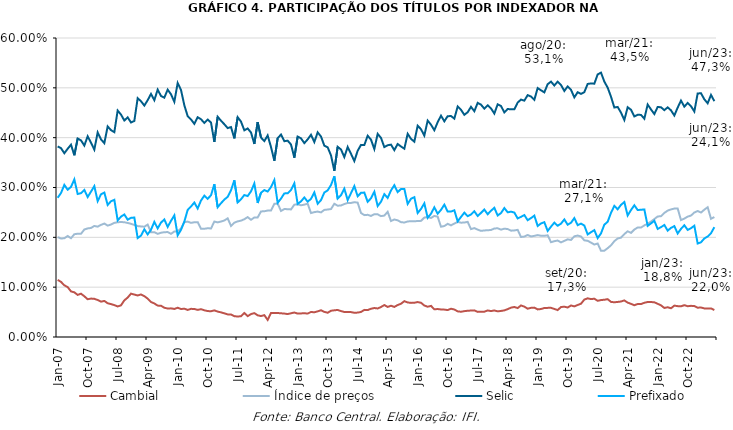
| Category | Cambial | Índice de preços | Selic | Prefixado |
|---|---|---|---|---|
| 2007-01-01 | 0.115 | 0.201 | 0.382 | 0.279 |
| 2007-02-01 | 0.111 | 0.198 | 0.379 | 0.289 |
| 2007-03-01 | 0.104 | 0.198 | 0.369 | 0.305 |
| 2007-04-01 | 0.1 | 0.203 | 0.378 | 0.296 |
| 2007-05-01 | 0.092 | 0.198 | 0.386 | 0.301 |
| 2007-06-01 | 0.09 | 0.206 | 0.365 | 0.316 |
| 2007-07-01 | 0.084 | 0.207 | 0.398 | 0.287 |
| 2007-08-01 | 0.087 | 0.207 | 0.395 | 0.289 |
| 2007-09-01 | 0.082 | 0.216 | 0.384 | 0.295 |
| 2007-10-01 | 0.076 | 0.218 | 0.403 | 0.281 |
| 2007-11-01 | 0.077 | 0.219 | 0.39 | 0.292 |
| 2007-12-01 | 0.077 | 0.223 | 0.376 | 0.303 |
| 2008-01-01 | 0.074 | 0.221 | 0.41 | 0.273 |
| 2008-02-01 | 0.071 | 0.225 | 0.397 | 0.286 |
| 2008-03-01 | 0.072 | 0.228 | 0.389 | 0.29 |
| 2008-04-01 | 0.068 | 0.224 | 0.423 | 0.265 |
| 2008-05-01 | 0.066 | 0.226 | 0.415 | 0.272 |
| 2008-06-01 | 0.064 | 0.229 | 0.411 | 0.275 |
| 2008-07-01 | 0.061 | 0.23 | 0.454 | 0.234 |
| 2008-08-01 | 0.064 | 0.231 | 0.446 | 0.242 |
| 2008-09-01 | 0.073 | 0.23 | 0.434 | 0.246 |
| 2008-10-01 | 0.079 | 0.229 | 0.441 | 0.235 |
| 2008-11-01 | 0.087 | 0.227 | 0.43 | 0.239 |
| 2008-12-01 | 0.085 | 0.225 | 0.434 | 0.24 |
| 2009-01-01 | 0.083 | 0.223 | 0.479 | 0.199 |
| 2009-02-01 | 0.085 | 0.222 | 0.473 | 0.203 |
| 2009-03-01 | 0.082 | 0.221 | 0.464 | 0.216 |
| 2009-04-01 | 0.077 | 0.226 | 0.475 | 0.206 |
| 2009-05-01 | 0.07 | 0.21 | 0.488 | 0.215 |
| 2009-06-01 | 0.067 | 0.21 | 0.475 | 0.231 |
| 2009-07-01 | 0.063 | 0.207 | 0.496 | 0.218 |
| 2009-08-01 | 0.063 | 0.209 | 0.484 | 0.23 |
| 2009-09-01 | 0.059 | 0.21 | 0.48 | 0.236 |
| 2009-10-01 | 0.057 | 0.211 | 0.496 | 0.221 |
| 2009-11-01 | 0.057 | 0.207 | 0.487 | 0.233 |
| 2009-12-01 | 0.056 | 0.212 | 0.472 | 0.244 |
| 2010-01-01 | 0.059 | 0.212 | 0.51 | 0.204 |
| 2010-02-01 | 0.056 | 0.218 | 0.496 | 0.215 |
| 2010-03-01 | 0.057 | 0.23 | 0.465 | 0.232 |
| 2010-04-01 | 0.054 | 0.232 | 0.443 | 0.255 |
| 2010-05-01 | 0.056 | 0.229 | 0.437 | 0.262 |
| 2010-06-01 | 0.056 | 0.23 | 0.428 | 0.27 |
| 2010-07-01 | 0.054 | 0.23 | 0.441 | 0.258 |
| 2010-08-01 | 0.056 | 0.217 | 0.437 | 0.274 |
| 2010-09-01 | 0.054 | 0.217 | 0.43 | 0.284 |
| 2010-10-01 | 0.052 | 0.218 | 0.436 | 0.277 |
| 2010-11-01 | 0.052 | 0.218 | 0.43 | 0.284 |
| 2010-12-01 | 0.053 | 0.232 | 0.391 | 0.307 |
| 2011-01-01 | 0.051 | 0.23 | 0.442 | 0.26 |
| 2011-02-01 | 0.049 | 0.232 | 0.434 | 0.268 |
| 2011-03-01 | 0.047 | 0.234 | 0.427 | 0.276 |
| 2011-04-01 | 0.045 | 0.238 | 0.419 | 0.281 |
| 2011-05-01 | 0.045 | 0.223 | 0.421 | 0.294 |
| 2011-06-01 | 0.042 | 0.229 | 0.399 | 0.315 |
| 2011-07-01 | 0.041 | 0.232 | 0.441 | 0.27 |
| 2011-08-01 | 0.042 | 0.233 | 0.432 | 0.276 |
| 2011-09-01 | 0.048 | 0.236 | 0.415 | 0.285 |
| 2011-10-01 | 0.042 | 0.241 | 0.418 | 0.283 |
| 2011-11-01 | 0.046 | 0.235 | 0.41 | 0.292 |
| 2011-12-01 | 0.048 | 0.24 | 0.387 | 0.308 |
| 2012-01-01 | 0.044 | 0.24 | 0.431 | 0.269 |
| 2012-02-01 | 0.042 | 0.252 | 0.4 | 0.29 |
| 2012-03-01 | 0.044 | 0.252 | 0.393 | 0.295 |
| 2012-04-01 | 0.034 | 0.254 | 0.404 | 0.292 |
| 2012-05-01 | 0.048 | 0.254 | 0.381 | 0.301 |
| 2012-06-01 | 0.048 | 0.267 | 0.354 | 0.315 |
| 2012-07-01 | 0.048 | 0.268 | 0.399 | 0.269 |
| 2012-08-01 | 0.048 | 0.253 | 0.406 | 0.278 |
| 2012-09-01 | 0.047 | 0.257 | 0.393 | 0.288 |
| 2012-10-01 | 0.046 | 0.256 | 0.394 | 0.288 |
| 2012-11-01 | 0.048 | 0.256 | 0.386 | 0.295 |
| 2012-12-01 | 0.049 | 0.266 | 0.36 | 0.308 |
| 2013-01-01 | 0.047 | 0.266 | 0.402 | 0.267 |
| 2013-02-01 | 0.047 | 0.264 | 0.399 | 0.272 |
| 2013-03-01 | 0.048 | 0.266 | 0.389 | 0.28 |
| 2013-04-01 | 0.047 | 0.268 | 0.397 | 0.272 |
| 2013-05-01 | 0.05 | 0.249 | 0.406 | 0.277 |
| 2013-06-01 | 0.05 | 0.251 | 0.391 | 0.29 |
| 2013-07-01 | 0.051 | 0.252 | 0.411 | 0.267 |
| 2013-08-01 | 0.054 | 0.25 | 0.402 | 0.275 |
| 2013-09-01 | 0.05 | 0.255 | 0.384 | 0.29 |
| 2013-10-01 | 0.049 | 0.256 | 0.381 | 0.294 |
| 2013-11-01 | 0.053 | 0.257 | 0.364 | 0.305 |
| 2013-12-01 | 0.054 | 0.267 | 0.334 | 0.323 |
| 2014-01-01 | 0.054 | 0.263 | 0.382 | 0.278 |
| 2014-02-01 | 0.052 | 0.264 | 0.376 | 0.285 |
| 2014-03-01 | 0.05 | 0.267 | 0.361 | 0.298 |
| 2014-04-01 | 0.05 | 0.269 | 0.381 | 0.275 |
| 2014-05-01 | 0.05 | 0.269 | 0.368 | 0.289 |
| 2014-06-01 | 0.049 | 0.271 | 0.353 | 0.303 |
| 2014-07-01 | 0.049 | 0.27 | 0.374 | 0.282 |
| 2014-08-01 | 0.05 | 0.249 | 0.386 | 0.289 |
| 2014-09-01 | 0.054 | 0.245 | 0.385 | 0.29 |
| 2014-10-01 | 0.054 | 0.245 | 0.404 | 0.271 |
| 2014-11-01 | 0.057 | 0.243 | 0.396 | 0.278 |
| 2014-12-01 | 0.058 | 0.246 | 0.377 | 0.292 |
| 2015-01-01 | 0.057 | 0.246 | 0.408 | 0.263 |
| 2015-02-01 | 0.06 | 0.243 | 0.4 | 0.271 |
| 2015-03-01 | 0.064 | 0.244 | 0.381 | 0.287 |
| 2015-04-01 | 0.06 | 0.251 | 0.385 | 0.279 |
| 2015-05-01 | 0.063 | 0.233 | 0.386 | 0.294 |
| 2015-06-01 | 0.06 | 0.236 | 0.375 | 0.305 |
| 2015-07-01 | 0.064 | 0.234 | 0.387 | 0.291 |
| 2015-08-01 | 0.067 | 0.23 | 0.382 | 0.297 |
| 2015-09-01 | 0.072 | 0.23 | 0.378 | 0.297 |
| 2015-10-01 | 0.069 | 0.232 | 0.408 | 0.267 |
| 2015-11-01 | 0.068 | 0.232 | 0.398 | 0.277 |
| 2015-12-01 | 0.069 | 0.232 | 0.392 | 0.281 |
| 2016-01-01 | 0.07 | 0.233 | 0.424 | 0.249 |
| 2016-02-01 | 0.069 | 0.233 | 0.417 | 0.257 |
| 2016-03-01 | 0.063 | 0.24 | 0.404 | 0.268 |
| 2016-04-01 | 0.061 | 0.241 | 0.434 | 0.239 |
| 2016-05-01 | 0.062 | 0.239 | 0.426 | 0.247 |
| 2016-06-01 | 0.056 | 0.243 | 0.415 | 0.26 |
| 2016-07-01 | 0.056 | 0.242 | 0.431 | 0.247 |
| 2016-08-01 | 0.055 | 0.221 | 0.444 | 0.255 |
| 2016-09-01 | 0.055 | 0.223 | 0.433 | 0.266 |
| 2016-10-01 | 0.054 | 0.227 | 0.443 | 0.252 |
| 2016-11-01 | 0.057 | 0.224 | 0.443 | 0.252 |
| 2016-12-01 | 0.055 | 0.228 | 0.438 | 0.254 |
| 2017-01-01 | 0.051 | 0.231 | 0.462 | 0.232 |
| 2017-02-01 | 0.051 | 0.229 | 0.456 | 0.241 |
| 2017-03-01 | 0.052 | 0.23 | 0.446 | 0.249 |
| 2017-04-01 | 0.053 | 0.231 | 0.451 | 0.243 |
| 2017-05-01 | 0.053 | 0.216 | 0.462 | 0.246 |
| 2017-06-01 | 0.053 | 0.219 | 0.453 | 0.252 |
| 2017-07-01 | 0.05 | 0.215 | 0.47 | 0.243 |
| 2017-08-01 | 0.05 | 0.213 | 0.466 | 0.249 |
| 2017-09-01 | 0.051 | 0.214 | 0.458 | 0.256 |
| 2017-10-01 | 0.053 | 0.214 | 0.465 | 0.246 |
| 2017-11-01 | 0.052 | 0.215 | 0.459 | 0.253 |
| 2017-12-01 | 0.053 | 0.218 | 0.448 | 0.259 |
| 2018-01-01 | 0.052 | 0.218 | 0.467 | 0.244 |
| 2018-02-01 | 0.052 | 0.215 | 0.464 | 0.249 |
| 2018-03-01 | 0.053 | 0.217 | 0.451 | 0.259 |
| 2018-04-01 | 0.056 | 0.217 | 0.458 | 0.25 |
| 2018-05-01 | 0.059 | 0.213 | 0.457 | 0.252 |
| 2018-06-01 | 0.06 | 0.214 | 0.457 | 0.25 |
| 2018-07-01 | 0.058 | 0.215 | 0.47 | 0.238 |
| 2018-08-01 | 0.063 | 0.201 | 0.476 | 0.241 |
| 2018-09-01 | 0.061 | 0.202 | 0.474 | 0.245 |
| 2018-10-01 | 0.057 | 0.205 | 0.485 | 0.234 |
| 2018-11-01 | 0.058 | 0.202 | 0.483 | 0.239 |
| 2018-12-01 | 0.059 | 0.203 | 0.476 | 0.244 |
| 2019-01-01 | 0.055 | 0.204 | 0.5 | 0.223 |
| 2019-02-01 | 0.056 | 0.203 | 0.495 | 0.228 |
| 2019-03-01 | 0.058 | 0.203 | 0.491 | 0.23 |
| 2019-04-01 | 0.058 | 0.204 | 0.507 | 0.213 |
| 2019-05-01 | 0.059 | 0.19 | 0.512 | 0.221 |
| 2019-06-01 | 0.056 | 0.192 | 0.505 | 0.229 |
| 2019-07-01 | 0.054 | 0.194 | 0.512 | 0.223 |
| 2019-08-01 | 0.06 | 0.19 | 0.506 | 0.227 |
| 2019-09-01 | 0.061 | 0.193 | 0.494 | 0.236 |
| 2019-10-01 | 0.059 | 0.196 | 0.503 | 0.225 |
| 2019-11-01 | 0.063 | 0.195 | 0.496 | 0.229 |
| 2019-12-01 | 0.061 | 0.202 | 0.481 | 0.239 |
| 2020-01-01 | 0.064 | 0.204 | 0.491 | 0.224 |
| 2020-02-01 | 0.067 | 0.202 | 0.488 | 0.228 |
| 2020-03-01 | 0.075 | 0.194 | 0.491 | 0.224 |
| 2020-04-01 | 0.078 | 0.193 | 0.508 | 0.206 |
| 2020-05-01 | 0.076 | 0.189 | 0.509 | 0.21 |
| 2020-06-01 | 0.077 | 0.186 | 0.508 | 0.214 |
| 2020-07-01 | 0.073 | 0.188 | 0.527 | 0.198 |
| 2020-08-01 | 0.074 | 0.173 | 0.531 | 0.208 |
| 2020-09-01 | 0.075 | 0.173 | 0.513 | 0.225 |
| 2020-10-01 | 0.076 | 0.178 | 0.5 | 0.231 |
| 2020-11-01 | 0.07 | 0.184 | 0.482 | 0.249 |
| 2020-12-01 | 0.07 | 0.192 | 0.461 | 0.263 |
| 2021-01-01 | 0.07 | 0.198 | 0.462 | 0.256 |
| 2021-02-01 | 0.071 | 0.199 | 0.45 | 0.265 |
| 2021-03-01 | 0.073 | 0.207 | 0.435 | 0.271 |
| 2021-04-01 | 0.069 | 0.212 | 0.461 | 0.244 |
| 2021-05-01 | 0.066 | 0.209 | 0.456 | 0.255 |
| 2021-06-01 | 0.064 | 0.216 | 0.443 | 0.264 |
| 2021-07-01 | 0.066 | 0.22 | 0.446 | 0.255 |
| 2021-08-01 | 0.066 | 0.22 | 0.446 | 0.255 |
| 2021-09-01 | 0.069 | 0.224 | 0.438 | 0.256 |
| 2021-10-01 | 0.07 | 0.227 | 0.467 | 0.223 |
| 2021-11-01 | 0.07 | 0.232 | 0.457 | 0.228 |
| 2021-12-01 | 0.07 | 0.237 | 0.447 | 0.233 |
| 2022-01-01 | 0.067 | 0.242 | 0.462 | 0.217 |
| 2022-02-01 | 0.063 | 0.242 | 0.461 | 0.22 |
| 2022-03-01 | 0.058 | 0.249 | 0.455 | 0.225 |
| 2022-04-01 | 0.06 | 0.254 | 0.461 | 0.213 |
| 2022-05-01 | 0.058 | 0.256 | 0.455 | 0.219 |
| 2022-06-01 | 0.063 | 0.258 | 0.444 | 0.222 |
| 2022-07-01 | 0.062 | 0.258 | 0.46 | 0.208 |
| 2022-08-01 | 0.062 | 0.235 | 0.474 | 0.217 |
| 2022-09-01 | 0.064 | 0.238 | 0.462 | 0.224 |
| 2022-10-01 | 0.062 | 0.242 | 0.47 | 0.215 |
| 2022-11-01 | 0.063 | 0.244 | 0.463 | 0.218 |
| 2022-12-01 | 0.062 | 0.25 | 0.453 | 0.223 |
| 2023-01-01 | 0.059 | 0.253 | 0.489 | 0.188 |
| 2023-02-01 | 0.059 | 0.25 | 0.489 | 0.19 |
| 2023-03-01 | 0.057 | 0.255 | 0.477 | 0.198 |
| 2023-04-01 | 0.057 | 0.26 | 0.469 | 0.202 |
| 2023-05-01 | 0.057 | 0.237 | 0.486 | 0.208 |
| 2023-06-01 | 0.054 | 0.241 | 0.473 | 0.22 |